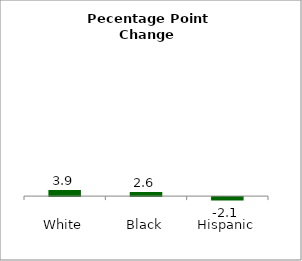
| Category | Series 0 |
|---|---|
| White | 3.928 |
| Black | 2.564 |
| Hispanic | -2.115 |